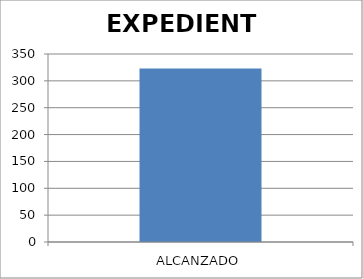
| Category | EXPEDIENTE |
|---|---|
| ALCANZADO | 323 |